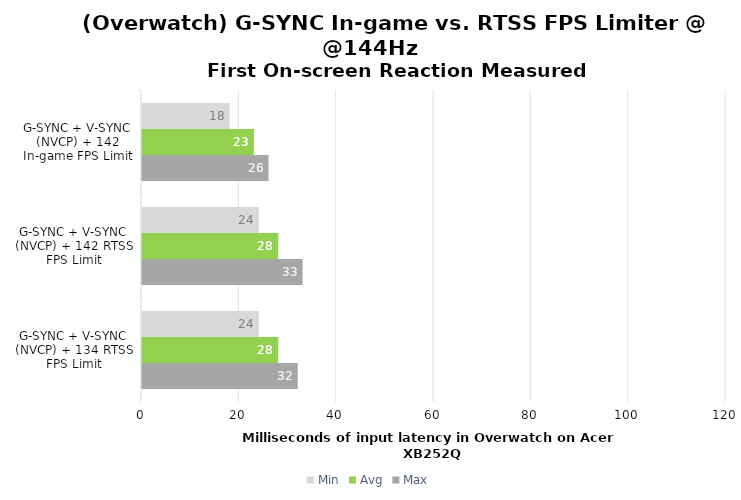
| Category | Min | Avg | Max |
|---|---|---|---|
| G-SYNC + V-SYNC (NVCP) + 142 In-game FPS Limit | 18 | 23 | 26 |
| G-SYNC + V-SYNC (NVCP) + 142 RTSS FPS Limit | 24 | 28 | 33 |
| G-SYNC + V-SYNC (NVCP) + 134 RTSS FPS Limit | 24 | 28 | 32 |